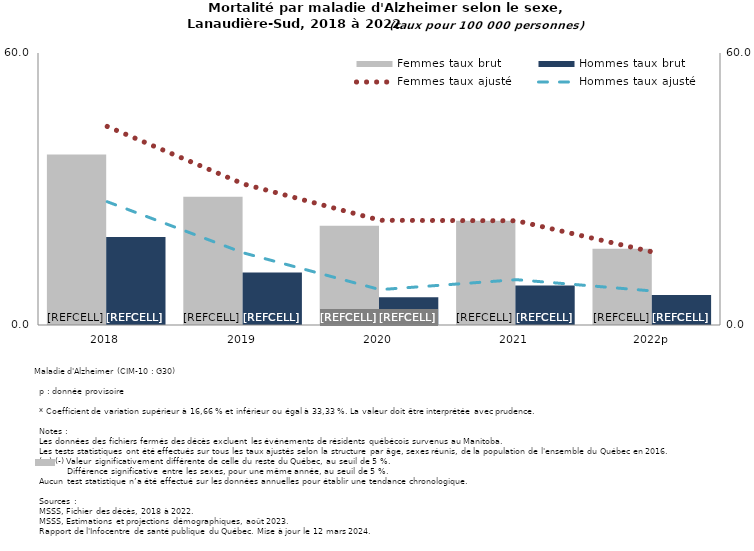
| Category | Femmes taux brut | Hommes taux brut |
|---|---|---|
| 2018 | 37.6 | 19.4 |
| 2019 | 28.3 | 11.6 |
| 2020 | 21.9 | 6.1 |
| 2021 | 23 | 8.7 |
| 2022p | 16.8 | 6.6 |